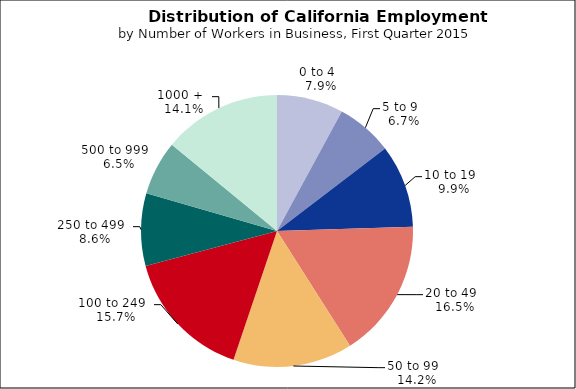
| Category | Series 0 |
|---|---|
| 0 to 4   | 0.079 |
| 5 to 9   | 0.067 |
| 10 to 19   | 0.099 |
| 20 to 49   | 0.165 |
| 50 to 99   | 0.142 |
| 100 to 249   | 0.157 |
| 250 to 499   | 0.086 |
| 500 to 999   | 0.065 |
| 1000 +   | 0.141 |